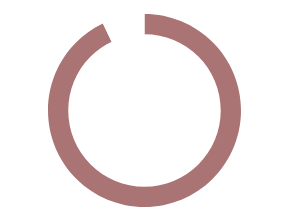
| Category | Series 0 |
|---|---|
| TOTAL VISITORS - YTD | 222966 |
| TO TARGET | 17034 |